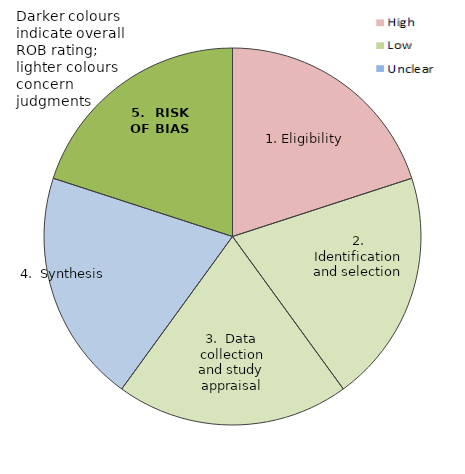
| Category | Series 0 | High | Low | Unclear |
|---|---|---|---|---|
| 1. Eligibility | 20 | 8 | 3 | 0 |
| 2. Identification and selection | 20 | 2 | 7 | 2 |
| 3.  Data collection and study appraisal | 20 | 0 | 11 | 0 |
| 4.  Synthesis | 20 | 1 | 10 | 0 |
| 5.  RISK OF BIAS | 20 | 7 | 4 | 0 |